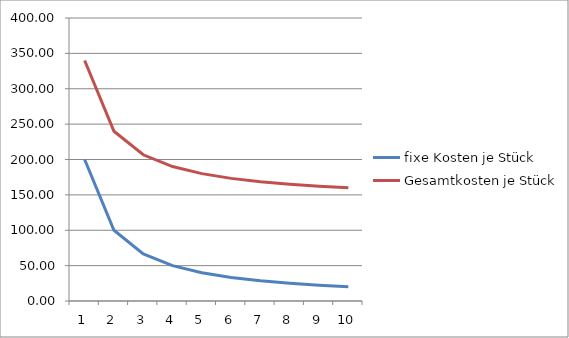
| Category | fixe Kosten je Stück | Gesamtkosten je Stück |
|---|---|---|
| 0 | 200 | 340 |
| 1 | 100 | 240 |
| 2 | 66.67 | 206.67 |
| 3 | 50 | 190 |
| 4 | 40 | 180 |
| 5 | 33.333 | 173.333 |
| 6 | 28.571 | 168.571 |
| 7 | 25 | 165 |
| 8 | 22.222 | 162.222 |
| 9 | 20 | 160 |